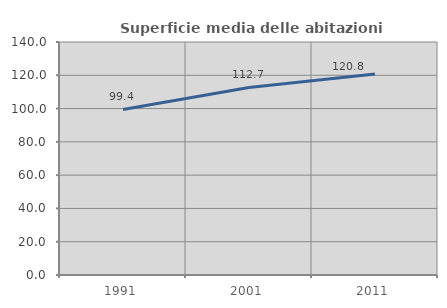
| Category | Superficie media delle abitazioni occupate |
|---|---|
| 1991.0 | 99.443 |
| 2001.0 | 112.67 |
| 2011.0 | 120.767 |